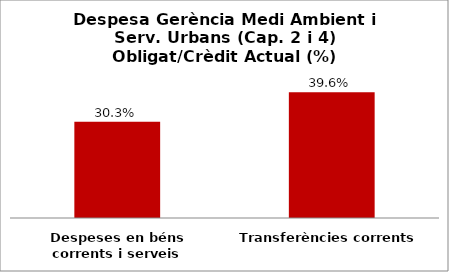
| Category | Series 0 |
|---|---|
| Despeses en béns corrents i serveis | 0.303 |
| Transferències corrents | 0.396 |